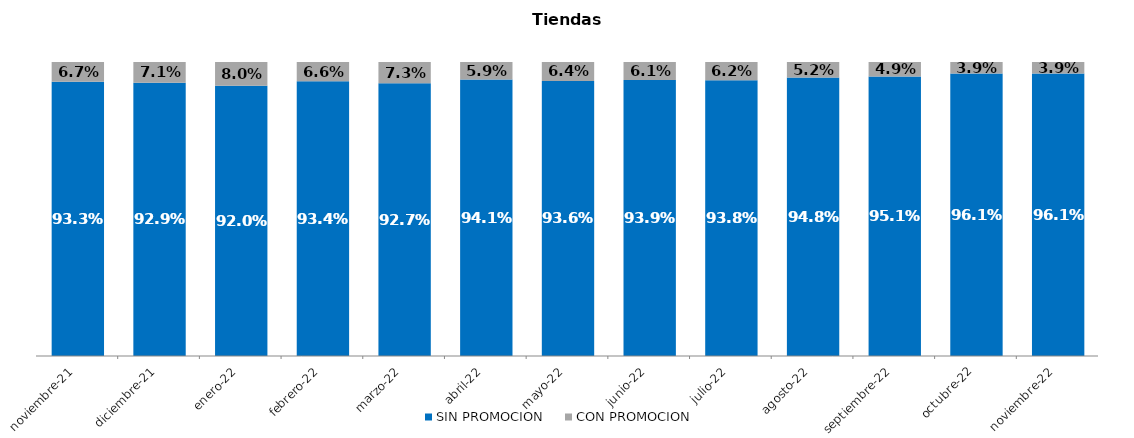
| Category | SIN PROMOCION   | CON PROMOCION   |
|---|---|---|
| 2021-11-01 | 0.933 | 0.067 |
| 2021-12-01 | 0.929 | 0.071 |
| 2022-01-01 | 0.92 | 0.08 |
| 2022-02-01 | 0.934 | 0.066 |
| 2022-03-01 | 0.927 | 0.073 |
| 2022-04-01 | 0.941 | 0.059 |
| 2022-05-01 | 0.936 | 0.064 |
| 2022-06-01 | 0.939 | 0.061 |
| 2022-07-01 | 0.938 | 0.062 |
| 2022-08-01 | 0.948 | 0.052 |
| 2022-09-01 | 0.951 | 0.049 |
| 2022-10-01 | 0.961 | 0.039 |
| 2022-11-01 | 0.961 | 0.039 |